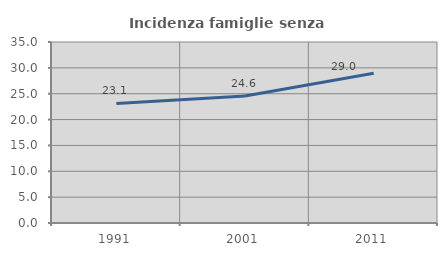
| Category | Incidenza famiglie senza nuclei |
|---|---|
| 1991.0 | 23.115 |
| 2001.0 | 24.557 |
| 2011.0 | 28.965 |